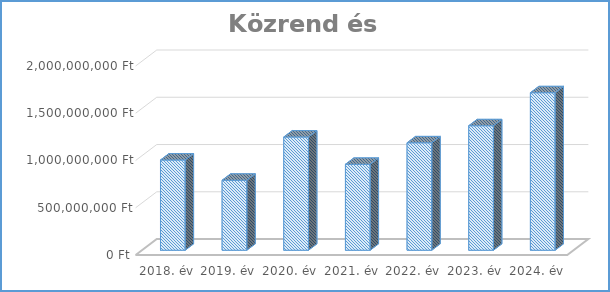
| Category | Közrend és közbiztonság |
|---|---|
| 2018. év | 954370373 |
| 2019. év | 740275000 |
| 2020. év | 1197789178 |
| 2021. év | 909016721 |
| 2022. év | 1136639696 |
| 2023. év | 1317145177 |
| 2024. év | 1666403927 |